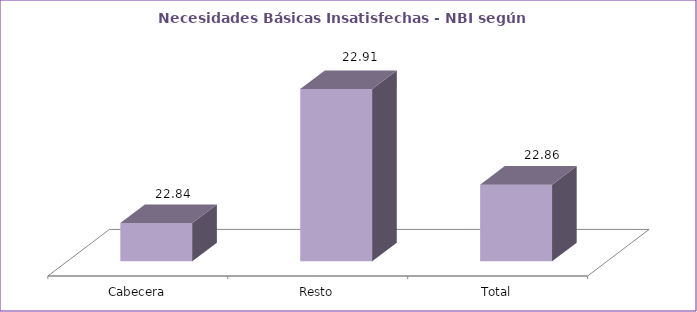
| Category | Series 0 |
|---|---|
| Cabecera | 22.84 |
| Resto | 22.91 |
| Total | 22.86 |